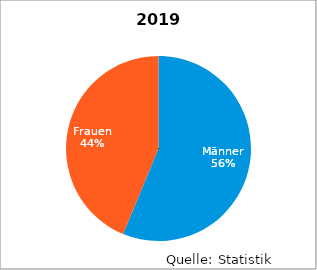
| Category | 2019 |
|---|---|
| Männer | 9 |
| Frauen | 7 |